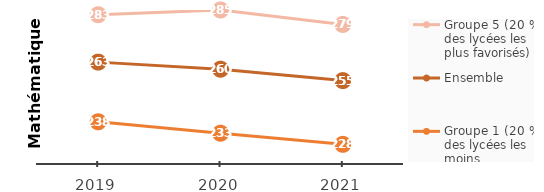
| Category | Groupe 5 (20 % des lycées les plus favorisés) | Ensemble | Groupe 1 (20 % des lycées les moins favorisés) |
|---|---|---|---|
| 2019.0 | 283 | 263 | 237.812 |
| 2020.0 | 285 | 260 | 233 |
| 2021.0 | 278.9 | 255.2 | 228.3 |